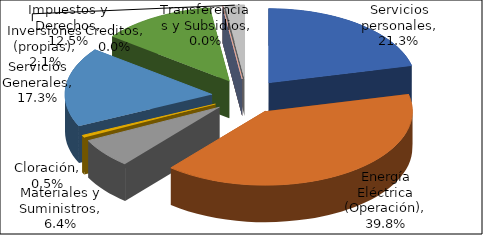
| Category | Series 1 |
|---|---|
| Servicios personales | 0.213 |
| Energía Eléctrica (Operación) | 0.398 |
| Materiales y Suministros | 0.064 |
| Cloración | 0.005 |
| Servicios Generales | 0.173 |
| Impuestos y Derechos | 0.125 |
| Transferencias y Subsidios | 0 |
| Creditos | 0 |
| Inversiones (propias) | 0.021 |